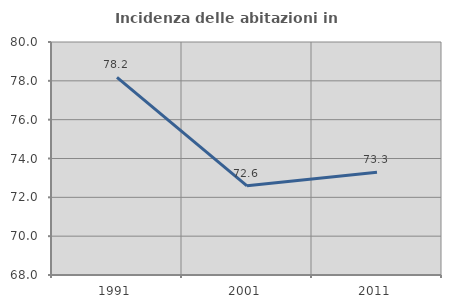
| Category | Incidenza delle abitazioni in proprietà  |
|---|---|
| 1991.0 | 78.182 |
| 2001.0 | 72.593 |
| 2011.0 | 73.288 |